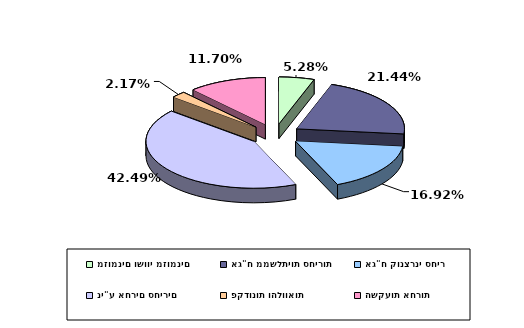
| Category | Series 0 |
|---|---|
| מזומנים ושווי מזומנים | 0.053 |
| אג"ח ממשלתיות סחירות | 0.214 |
| אג"ח קונצרני סחיר | 0.169 |
| ני"ע אחרים סחירים | 0.425 |
| פקדונות והלוואות | 0.022 |
| השקעות אחרות | 0.117 |